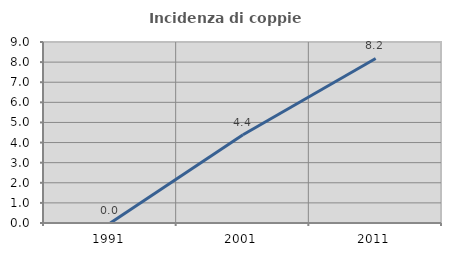
| Category | Incidenza di coppie miste |
|---|---|
| 1991.0 | 0 |
| 2001.0 | 4.386 |
| 2011.0 | 8.182 |